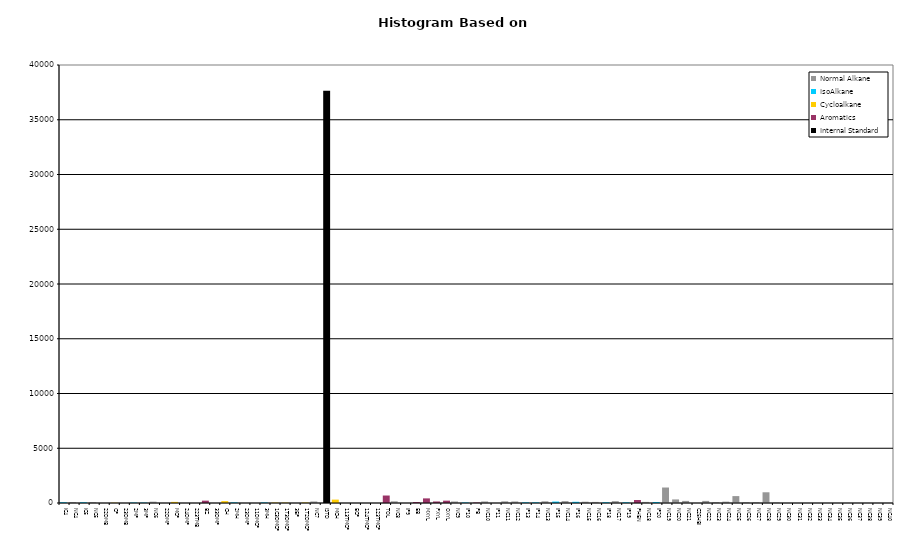
| Category | Normal Alkane | IsoAlkane | Cycloalkane | Aromatics | Internal Standard |
|---|---|---|---|---|---|
| IC4 | 0 | 67 | 0 | 0 | 0 |
| NC4 | 77 | 0 | 0 | 0 | 0 |
| IC5 | 0 | 66 | 0 | 0 | 0 |
| NC5 | 76 | 0 | 0 | 0 | 0 |
| 22DMB | 0 | 0 | 0 | 0 | 0 |
| CP | 0 | 0 | 23 | 0 | 0 |
| 23DMB | 0 | 0 | 0 | 0 | 0 |
| 2MP | 0 | 43 | 0 | 0 | 0 |
| 3MP | 0 | 38 | 0 | 0 | 0 |
| NC6 | 120 | 0 | 0 | 0 | 0 |
| 22DMP | 0 | 0 | 0 | 0 | 0 |
| MCP | 0 | 0 | 101 | 0 | 0 |
| 24DMP | 0 | 0 | 0 | 0 | 0 |
| 223TMB | 0 | 0 | 0 | 0 | 0 |
| BZ | 0 | 0 | 0 | 214 | 0 |
| 33DMP | 0 | 0 | 0 | 0 | 0 |
| CH | 0 | 0 | 171 | 0 | 0 |
| 2MH | 0 | 58 | 0 | 0 | 0 |
| 23DMP | 0 | 0 | 0 | 0 | 0 |
| 11DMCP | 0 | 0 | 0 | 0 | 0 |
| 3MH | 0 | 53 | 0 | 0 | 0 |
| 1C3DMCP | 0 | 0 | 37 | 0 | 0 |
| 1T3DMCP | 0 | 0 | 34 | 0 | 0 |
| 3EP | 0 | 0 | 0 | 0 | 0 |
| 1T2DMCP | 0 | 0 | 42 | 0 | 0 |
| NC7 | 138 | 0 | 0 | 0 | 0 |
| ISTD | 0 | 0 | 0 | 0 | 37644 |
| MCH | 0 | 0 | 309 | 0 | 0 |
| 113TMCP | 0 | 0 | 0 | 0 | 0 |
| ECP | 0 | 0 | 0 | 0 | 0 |
| 124TMCP | 0 | 0 | 0 | 0 | 0 |
| 123TMCP | 0 | 0 | 0 | 0 | 0 |
| TOL | 0 | 0 | 0 | 683 | 0 |
| NC8 | 152 | 0 | 0 | 0 | 0 |
| IP9 | 0 | 0 | 0 | 0 | 0 |
| EB | 0 | 0 | 0 | 93 | 0 |
| MXYL | 0 | 0 | 0 | 422 | 0 |
| PXYL | 0 | 0 | 0 | 140 | 0 |
| OXYL | 0 | 0 | 0 | 214 | 0 |
| NC9 | 136 | 0 | 0 | 0 | 0 |
| IP10 | 0 | 50 | 0 | 0 | 0 |
| PB | 0 | 0 | 0 | 46 | 0 |
| NC10 | 140 | 0 | 0 | 0 | 0 |
| IP11 | 0 | 0 | 0 | 0 | 0 |
| NC11 | 151 | 0 | 0 | 0 | 0 |
| NC12 | 139 | 0 | 0 | 0 | 0 |
| IP13 | 0 | 60 | 0 | 0 | 0 |
| IP14 | 0 | 59 | 0 | 0 | 0 |
| NC13 | 154 | 0 | 0 | 0 | 0 |
| IP15 | 0 | 132 | 0 | 0 | 0 |
| NC14 | 171 | 0 | 0 | 0 | 0 |
| IP16 | 0 | 111 | 0 | 0 | 0 |
| NC15 | 117 | 0 | 0 | 0 | 0 |
| NC16 | 99 | 0 | 0 | 0 | 0 |
| IP18 | 0 | 69 | 0 | 0 | 0 |
| NC17 | 169 | 0 | 0 | 0 | 0 |
| IP19 | 0 | 65 | 0 | 0 | 0 |
| PHEN | 0 | 0 | 0 | 274 | 0 |
| NC18 | 100 | 0 | 0 | 0 | 0 |
| IP20 | 0 | 90 | 0 | 0 | 0 |
| NC19 | 1414 | 0 | 0 | 0 | 0 |
| NC20 | 326 | 0 | 0 | 0 | 0 |
| NC21 | 190 | 0 | 0 | 0 | 0 |
| C25HBI | 0 | 0 | 0 | 0 | 0 |
| NC22 | 190 | 0 | 0 | 0 | 0 |
| NC23 | 77 | 0 | 0 | 0 | 0 |
| NC24 | 124 | 0 | 0 | 0 | 0 |
| NC25 | 631 | 0 | 0 | 0 | 0 |
| NC26 | 73 | 0 | 0 | 0 | 0 |
| NC27 | 70 | 0 | 0 | 0 | 0 |
| NC28 | 979 | 0 | 0 | 0 | 0 |
| NC29 | 44 | 0 | 0 | 0 | 0 |
| NC30 | 0 | 0 | 0 | 0 | 0 |
| NC31 | 0 | 0 | 0 | 0 | 0 |
| NC32 | 0 | 0 | 0 | 0 | 0 |
| NC33 | 0 | 0 | 0 | 0 | 0 |
| NC34 | 0 | 0 | 0 | 0 | 0 |
| NC35 | 0 | 0 | 0 | 0 | 0 |
| NC36 | 0 | 0 | 0 | 0 | 0 |
| NC37 | 0 | 0 | 0 | 0 | 0 |
| NC38 | 0 | 0 | 0 | 0 | 0 |
| NC39 | 0 | 0 | 0 | 0 | 0 |
| NC40 | 0 | 0 | 0 | 0 | 0 |